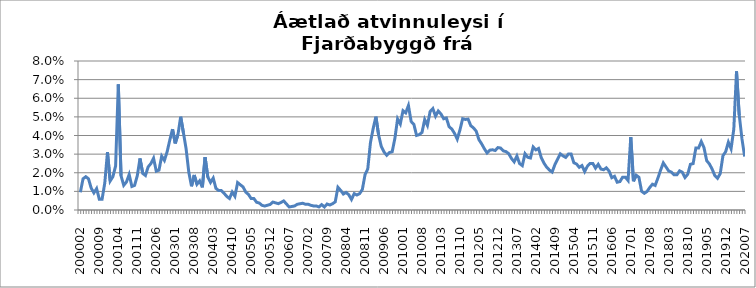
| Category | Series 0 |
|---|---|
| 200002 | 0.009 |
| 200003 | 0.017 |
| 200004 | 0.018 |
| 200005 | 0.017 |
| 200006 | 0.012 |
| 200007 | 0.009 |
| 200008 | 0.012 |
| 200009 | 0.006 |
| 200010 | 0.006 |
| 200011 | 0.014 |
| 200012 | 0.031 |
| 200101 | 0.016 |
| 200102 | 0.018 |
| 200103 | 0.024 |
| 200104 | 0.067 |
| 200105 | 0.018 |
| 200106 | 0.013 |
| 200107 | 0.015 |
| 200108 | 0.019 |
| 200109 | 0.013 |
| 200110 | 0.013 |
| 200111 | 0.018 |
| 200112 | 0.028 |
| 200201 | 0.02 |
| 200202 | 0.019 |
| 200203 | 0.023 |
| 200204 | 0.025 |
| 200205 | 0.028 |
| 200206 | 0.021 |
| 200207 | 0.021 |
| 200208 | 0.029 |
| 200209 | 0.027 |
| 200210 | 0.031 |
| 200211 | 0.038 |
| 200212 | 0.043 |
| 200301 | 0.036 |
| 200302 | 0.041 |
| 200303 | 0.05 |
| 200304 | 0.042 |
| 200305 | 0.033 |
| 200306 | 0.02 |
| 200307 | 0.013 |
| 200308 | 0.019 |
| 200309 | 0.014 |
| 200310 | 0.016 |
| 200311 | 0.012 |
| 200312 | 0.028 |
| 200401 | 0.018 |
| 200402 | 0.015 |
| 200403 | 0.017 |
| 200404 | 0.012 |
| 200405 | 0.01 |
| 200406 | 0.01 |
| 200407 | 0.009 |
| 200408 | 0.007 |
| 200409 | 0.006 |
| 200410 | 0.01 |
| 200411 | 0.007 |
| 200412 | 0.015 |
| 200501 | 0.014 |
| 200502 | 0.012 |
| 200503 | 0.01 |
| 200504 | 0.008 |
| 200505 | 0.006 |
| 200506 | 0.006 |
| 200507 | 0.004 |
| 200508 | 0.004 |
| 200509 | 0.002 |
| 200510 | 0.002 |
| 200511 | 0.003 |
| 200512 | 0.003 |
| 200601 | 0.004 |
| 200602 | 0.004 |
| 200603 | 0.003 |
| 200604 | 0.004 |
| 200605 | 0.005 |
| 200606 | 0.003 |
| 200607 | 0.002 |
| 200608 | 0.002 |
| 200609 | 0.002 |
| 200610 | 0.003 |
| 200611 | 0.003 |
| 200612 | 0.004 |
| 200701 | 0.003 |
| 200702 | 0.003 |
| 200703 | 0.003 |
| 200704 | 0.002 |
| 200705 | 0.002 |
| 200706 | 0.002 |
| 200707 | 0.003 |
| 200708 | 0.002 |
| 200709 | 0.003 |
| 200710 | 0.003 |
| 200711 | 0.003 |
| 200712 | 0.004 |
| 200801 | 0.012 |
| 200802 | 0.011 |
| 200803 | 0.009 |
| 200804 | 0.009 |
| 200805 | 0.008 |
| 200806 | 0.006 |
| 200807 | 0.009 |
| 200808 | 0.008 |
| 200809 | 0.009 |
| 200810 | 0.011 |
| 200811 | 0.019 |
| 200812 | 0.022 |
| 200901 | 0.036 |
| 200902 | 0.044 |
| 200903 | 0.05 |
| 200904 | 0.04 |
| 200905 | 0.034 |
| 200906 | 0.031 |
| 200907 | 0.029 |
| 200908 | 0.031 |
| 200909 | 0.031 |
| 200910 | 0.038 |
| 200911 | 0.049 |
| 200912 | 0.046 |
| 201001 | 0.053 |
| 201002 | 0.052 |
| 201003 | 0.056 |
| 201004 | 0.048 |
| 201005 | 0.046 |
| 201006 | 0.04 |
| 201007 | 0.04 |
| 201008 | 0.042 |
| 201009 | 0.049 |
| 201010 | 0.045 |
| 201011 | 0.053 |
| 201012 | 0.054 |
| 201101 | 0.05 |
| 201102 | 0.053 |
| 201103 | 0.052 |
| 201104 | 0.049 |
| 201105 | 0.049 |
| 201106 | 0.045 |
| 201107 | 0.043 |
| 201108 | 0.041 |
| 201109 | 0.038 |
| 201110 | 0.043 |
| 201111 | 0.049 |
| 201112 | 0.049 |
| 201201 | 0.049 |
| 201202 | 0.045 |
| 201203 | 0.044 |
| 201204 | 0.042 |
| 201205 | 0.038 |
| 201206 | 0.036 |
| 201207 | 0.033 |
| 201208 | 0.031 |
| 201209 | 0.032 |
| 201210 | 0.032 |
| 201211 | 0.032 |
| 201212 | 0.034 |
| 201301 | 0.033 |
| 201302 | 0.032 |
| 201303 | 0.031 |
| 201304 | 0.03 |
| 201305 | 0.028 |
| 201306 | 0.026 |
| 201307 | 0.029 |
| 201308 | 0.025 |
| 201309 | 0.024 |
| 201310 | 0.03 |
| 201311 | 0.028 |
| 201312 | 0.028 |
| 201401 | 0.034 |
| 201402 | 0.032 |
| 201403 | 0.033 |
| 201404 | 0.028 |
| 201405 | 0.025 |
| 201406 | 0.023 |
| 201407 | 0.021 |
| 201408 | 0.02 |
| 201409 | 0.024 |
| 201410 | 0.027 |
| 201411 | 0.03 |
| 201412 | 0.029 |
| 201501 | 0.028 |
| 201502 | 0.03 |
| 201503 | 0.03 |
| 201504 | 0.025 |
| 201505 | 0.025 |
| 201506 | 0.023 |
| 201507 | 0.024 |
| 201508 | 0.021 |
| 201509 | 0.023 |
| 201510 | 0.025 |
| 201511 | 0.025 |
| 201512 | 0.022 |
| 201601 | 0.025 |
| 201602 | 0.022 |
| 201603 | 0.022 |
| 201604 | 0.023 |
| 201605 | 0.021 |
| 201606 | 0.017 |
| 201607 | 0.018 |
| 201608 | 0.015 |
| 201609 | 0.015 |
| 201610 | 0.018 |
| 201611 | 0.018 |
| 201612 | 0.016 |
| 201701 | 0.039 |
| 201702 | 0.015 |
| 201703 | 0.019 |
| 201704 | 0.018 |
| 201705 | 0.01 |
| 201706 | 0.009 |
| 201707 | 0.01 |
| 201708 | 0.012 |
| 201709 | 0.014 |
| 201710 | 0.013 |
| 201711 | 0.017 |
| 201712 | 0.021 |
| 201801 | 0.025 |
| 201802 | 0.023 |
| 201803 | 0.021 |
| 201804 | 0.02 |
| 201805 | 0.019 |
| 201806 | 0.019 |
| 201807 | 0.021 |
| 201808 | 0.02 |
| 201809 | 0.017 |
| 201810 | 0.019 |
| 201811 | 0.025 |
| 201812 | 0.025 |
| 201901 | 0.033 |
| 201902 | 0.033 |
| 201903 | 0.037 |
| 201904 | 0.034 |
| 201905 | 0.026 |
| 201906 | 0.025 |
| 201907 | 0.022 |
| 201908 | 0.018 |
| 201909 | 0.017 |
| 201910 | 0.02 |
| 201911 | 0.029 |
| 201912 | 0.031 |
| 202001 | 0.036 |
| 202002 | 0.033 |
| 202003 | 0.043 |
| 202004 | 0.074 |
| 202005 | 0.051 |
| 202006 | 0.038 |
| 202007 | 0.029 |